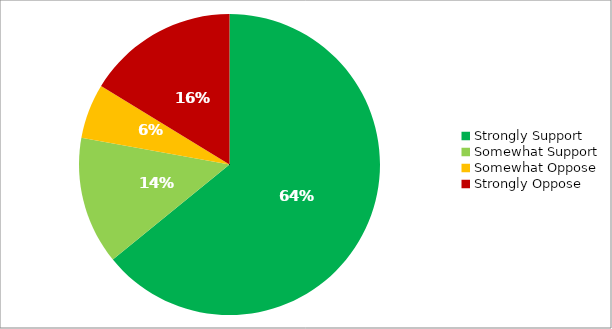
| Category | Responses |
|---|---|
| Strongly Support | 0.641 |
| Somewhat Support | 0.137 |
| Somewhat Oppose | 0.059 |
| Strongly Oppose | 0.163 |